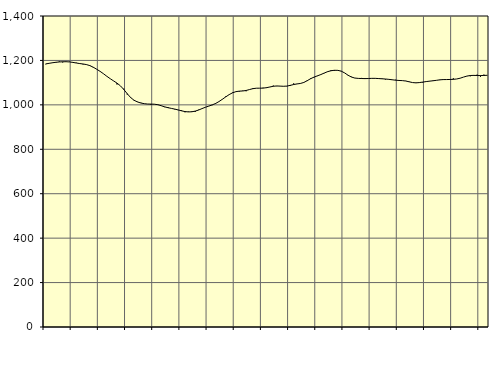
| Category | Piggar | Series 1 |
|---|---|---|
| nan | 1182.7 | 1184.3 |
| 87.0 | 1187.1 | 1186.91 |
| 87.0 | 1188.6 | 1189.51 |
| 87.0 | 1190 | 1191.73 |
| nan | 1195.5 | 1193.1 |
| 88.0 | 1191 | 1193.93 |
| 88.0 | 1195.1 | 1194.16 |
| 88.0 | 1194.6 | 1193.26 |
| nan | 1190.3 | 1191.18 |
| 89.0 | 1189.7 | 1188.4 |
| 89.0 | 1187.2 | 1185.95 |
| 89.0 | 1182.1 | 1183.97 |
| nan | 1182.1 | 1181.3 |
| 90.0 | 1178 | 1176.63 |
| 90.0 | 1167.8 | 1169.41 |
| 90.0 | 1160.9 | 1160.57 |
| nan | 1151.1 | 1150.93 |
| 91.0 | 1140.4 | 1140.17 |
| 91.0 | 1128.3 | 1128.62 |
| 91.0 | 1117.7 | 1117.67 |
| nan | 1107.9 | 1107.63 |
| 92.0 | 1091.7 | 1097.76 |
| 92.0 | 1085.5 | 1085.55 |
| 92.0 | 1072.7 | 1069.04 |
| nan | 1046.5 | 1050.15 |
| 93.0 | 1031.4 | 1032.95 |
| 93.0 | 1021.9 | 1020.77 |
| 93.0 | 1014.2 | 1013.25 |
| nan | 1009.7 | 1008.35 |
| 94.0 | 1005.3 | 1005.34 |
| 94.0 | 1003.9 | 1003.71 |
| 94.0 | 1000.7 | 1003.3 |
| nan | 1002.6 | 1002.94 |
| 95.0 | 1001.9 | 1000.74 |
| 95.0 | 995.6 | 996.22 |
| 95.0 | 989.8 | 991.1 |
| nan | 990.3 | 987.2 |
| 96.0 | 984.4 | 984.09 |
| 96.0 | 979.5 | 980.89 |
| 96.0 | 976.2 | 977.15 |
| nan | 975.5 | 973.08 |
| 97.0 | 966.6 | 969.76 |
| 97.0 | 969.9 | 968.24 |
| 97.0 | 971 | 968.88 |
| nan | 968 | 971.73 |
| 98.0 | 978 | 976.62 |
| 98.0 | 982.7 | 983.06 |
| 98.0 | 988.5 | 989.1 |
| nan | 994.9 | 994.37 |
| 99.0 | 998.6 | 999.72 |
| 99.0 | 1004.2 | 1006.1 |
| 99.0 | 1014.6 | 1014.71 |
| nan | 1025.8 | 1025.08 |
| 0.0 | 1038.1 | 1035.8 |
| 0.0 | 1045.5 | 1046.03 |
| 0.0 | 1055.7 | 1054.19 |
| nan | 1059.8 | 1059.46 |
| 1.0 | 1059.5 | 1061.69 |
| 1.0 | 1063.8 | 1062.46 |
| 1.0 | 1061.3 | 1064.74 |
| nan | 1069.3 | 1068.95 |
| 2.0 | 1075.1 | 1072.89 |
| 2.0 | 1074.7 | 1074.9 |
| 2.0 | 1075.2 | 1075.07 |
| nan | 1077.1 | 1075.33 |
| 3.0 | 1075.8 | 1077.33 |
| 3.0 | 1080.2 | 1080.51 |
| 3.0 | 1086.6 | 1083.68 |
| nan | 1084.2 | 1085.03 |
| 4.0 | 1084.2 | 1084.39 |
| 4.0 | 1083.2 | 1083.67 |
| 4.0 | 1083.6 | 1084.53 |
| nan | 1084.9 | 1087.72 |
| 5.0 | 1096.6 | 1091.55 |
| 5.0 | 1094.6 | 1094.23 |
| 5.0 | 1095.6 | 1096.4 |
| nan | 1100.4 | 1100.92 |
| 6.0 | 1107.1 | 1109 |
| 6.0 | 1120 | 1117.81 |
| 6.0 | 1123.6 | 1124.95 |
| nan | 1129.6 | 1130.61 |
| 7.0 | 1137.1 | 1136.42 |
| 7.0 | 1142.4 | 1143.25 |
| 7.0 | 1150.5 | 1149.44 |
| nan | 1156.5 | 1153.62 |
| 8.0 | 1153.1 | 1155.58 |
| 8.0 | 1156.1 | 1155.31 |
| 8.0 | 1152.8 | 1151.64 |
| nan | 1143.5 | 1143.81 |
| 9.0 | 1134.2 | 1133.49 |
| 9.0 | 1126.5 | 1125.25 |
| 9.0 | 1120.4 | 1120.73 |
| nan | 1119.2 | 1119.13 |
| 10.0 | 1121.2 | 1118.52 |
| 10.0 | 1116.4 | 1118.18 |
| 10.0 | 1117.7 | 1118.57 |
| nan | 1119.7 | 1119.34 |
| 11.0 | 1119.5 | 1119.33 |
| 11.0 | 1119.6 | 1118.42 |
| 11.0 | 1116.4 | 1117.44 |
| nan | 1114.1 | 1116.38 |
| 12.0 | 1114.2 | 1114.8 |
| 12.0 | 1112.2 | 1112.93 |
| 12.0 | 1112.9 | 1111.04 |
| nan | 1108.9 | 1109.79 |
| 13.0 | 1108.9 | 1109.09 |
| 13.0 | 1108 | 1107.31 |
| 13.0 | 1105 | 1103.8 |
| nan | 1100.5 | 1100.35 |
| 14.0 | 1098.2 | 1099.12 |
| 14.0 | 1101.3 | 1100.28 |
| 14.0 | 1100.3 | 1102.49 |
| nan | 1104.6 | 1104.77 |
| 15.0 | 1107.5 | 1106.69 |
| 15.0 | 1107.4 | 1108.44 |
| 15.0 | 1110.7 | 1110.39 |
| nan | 1111.5 | 1112.61 |
| 16.0 | 1114.8 | 1113.73 |
| 16.0 | 1114.4 | 1113.93 |
| 16.0 | 1112.3 | 1114.24 |
| nan | 1119.3 | 1114.86 |
| 17.0 | 1116.5 | 1116.47 |
| 17.0 | 1120.1 | 1119.94 |
| 17.0 | 1125 | 1124.99 |
| nan | 1129.2 | 1129.53 |
| 18.0 | 1128.7 | 1132.15 |
| 18.0 | 1130.6 | 1132.69 |
| 18.0 | 1136 | 1132.13 |
| nan | 1126.5 | 1131.83 |
| 19.0 | 1136.2 | 1132.34 |
| 19.0 | 1133.8 | 1133.18 |